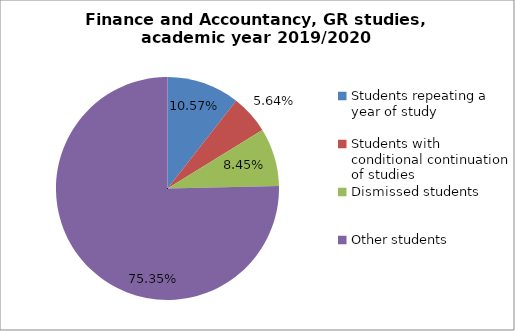
| Category | Series 0 |
|---|---|
| Students repeating a year of study | 15 |
| Students with conditional continuation of studies | 8 |
| Dismissed students | 12 |
| Other students | 107 |